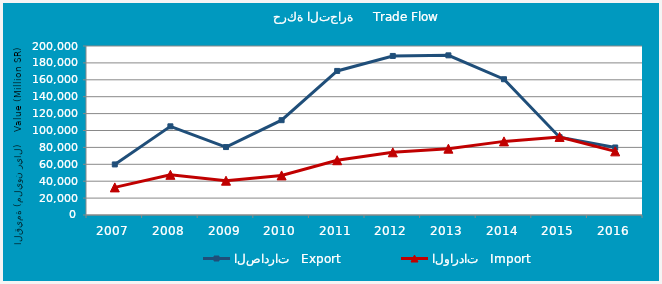
| Category | الصادرات   Export | الواردات   Import |
|---|---|---|
| 2007.0 | 59840.453 | 32664.141 |
| 2008.0 | 104953.841 | 47541.275 |
| 2009.0 | 80417.434 | 40601.283 |
| 2010.0 | 112210.313 | 46851.348 |
| 2011.0 | 170500.057 | 64828.774 |
| 2012.0 | 188229.064 | 74194.573 |
| 2013.0 | 188936.497 | 78487.712 |
| 2014.0 | 160680.232 | 87121.671 |
| 2015.0 | 92069.105 | 92397.907 |
| 2016.0 | 79916.121 | 75308.865 |